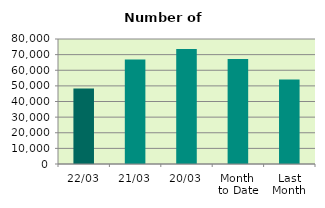
| Category | Series 0 |
|---|---|
| 22/03 | 48252 |
| 21/03 | 66856 |
| 20/03 | 73630 |
| Month 
to Date | 67260.5 |
| Last
Month | 54034.8 |